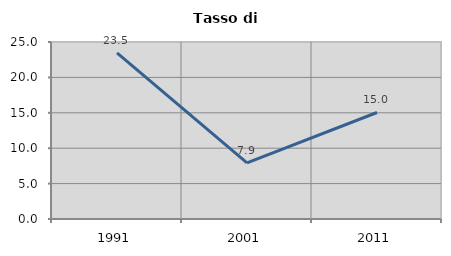
| Category | Tasso di disoccupazione   |
|---|---|
| 1991.0 | 23.455 |
| 2001.0 | 7.928 |
| 2011.0 | 15.044 |